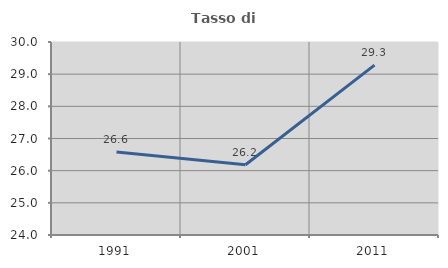
| Category | Tasso di occupazione   |
|---|---|
| 1991.0 | 26.584 |
| 2001.0 | 26.184 |
| 2011.0 | 29.282 |